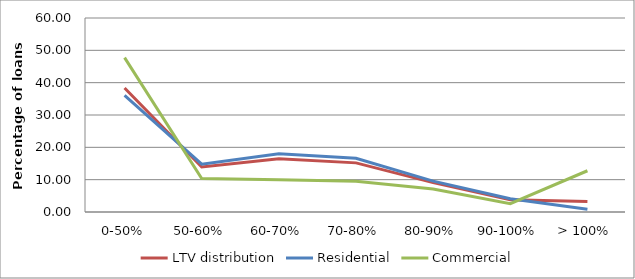
| Category | LTV distribution | Residential | Commercial |
|---|---|---|---|
| 0-50% | 38.372 | 36.071 | 47.746 |
| 50-60% | 13.921 | 14.794 | 10.364 |
| 60-70% | 16.439 | 18.034 | 9.938 |
| 70-80% | 15.194 | 16.596 | 9.483 |
| 80-90% | 9.075 | 9.557 | 7.113 |
| 90-100% | 3.787 | 4.078 | 2.598 |
| > 100% | 3.212 | 0.869 | 12.758 |